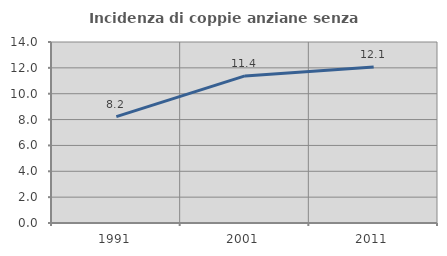
| Category | Incidenza di coppie anziane senza figli  |
|---|---|
| 1991.0 | 8.223 |
| 2001.0 | 11.376 |
| 2011.0 | 12.069 |